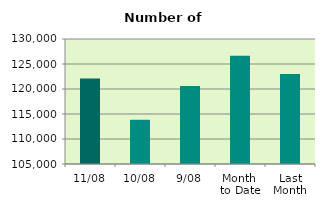
| Category | Series 0 |
|---|---|
| 11/08 | 122084 |
| 10/08 | 113842 |
| 9/08 | 120582 |
| Month 
to Date | 126663.5 |
| Last
Month | 122991 |